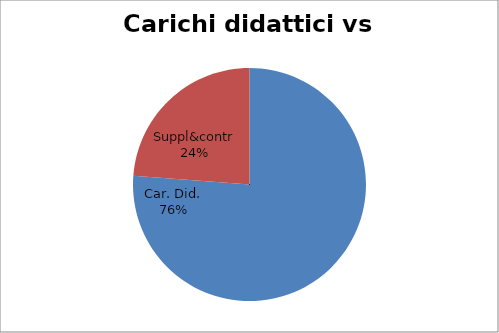
| Category | Series 0 |
|---|---|
| Car. Did. | 0.762 |
| Suppl&contr | 0.238 |